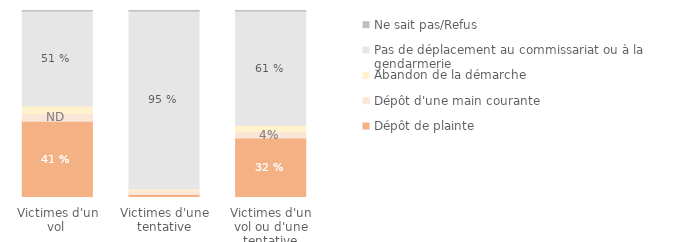
| Category | Dépôt de plainte | Dépôt d'une main courante | Abandon de la démarche | Pas de déplacement au commissariat ou à la gendarmerie | Ne sait pas/Refus |
|---|---|---|---|---|---|
| Victimes d'un vol  | 0.408 | 0.04 | 0.041 | 0.507 | 0.003 |
| Victimes d'une tentative | 0.016 | 0.019 | 0.01 | 0.952 | 0.002 |
| Victimes d'un vol ou d'une tentative | 0.318 | 0.036 | 0.034 | 0.61 | 0.003 |